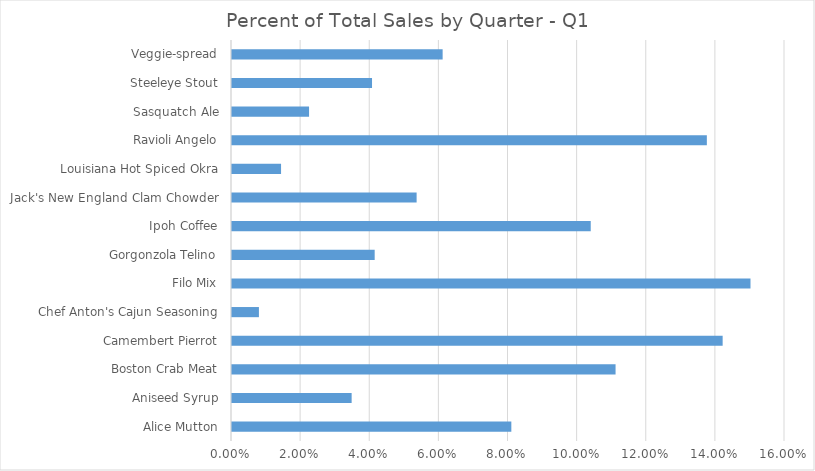
| Category | Percent of Q1 |
|---|---|
| Alice Mutton | 0.081 |
| Aniseed Syrup | 0.035 |
| Boston Crab Meat | 0.111 |
| Camembert Pierrot | 0.142 |
| Chef Anton's Cajun Seasoning | 0.008 |
| Filo Mix | 0.15 |
| Gorgonzola Telino | 0.041 |
| Ipoh Coffee | 0.104 |
| Jack's New England Clam Chowder | 0.053 |
| Louisiana Hot Spiced Okra | 0.014 |
| Ravioli Angelo | 0.137 |
| Sasquatch Ale | 0.022 |
| Steeleye Stout | 0.041 |
| Veggie-spread | 0.061 |